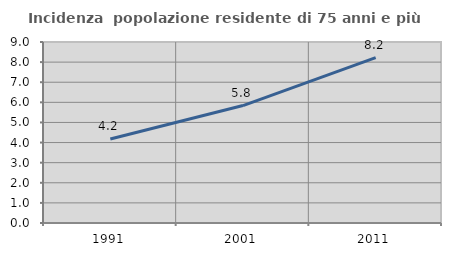
| Category | Incidenza  popolazione residente di 75 anni e più |
|---|---|
| 1991.0 | 4.177 |
| 2001.0 | 5.84 |
| 2011.0 | 8.22 |